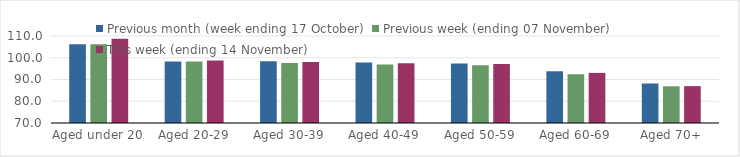
| Category | Previous month (week ending 17 October) | Previous week (ending 07 November) | This week (ending 14 November) |
|---|---|---|---|
| Aged under 20 | 106.24 | 106.15 | 108.74 |
| Aged 20-29 | 98.3 | 98.24 | 98.72 |
| Aged 30-39 | 98.37 | 97.56 | 98.04 |
| Aged 40-49 | 97.83 | 96.9 | 97.52 |
| Aged 50-59 | 97.38 | 96.55 | 97.17 |
| Aged 60-69 | 93.85 | 92.41 | 93.04 |
| Aged 70+ | 88.16 | 86.88 | 86.95 |